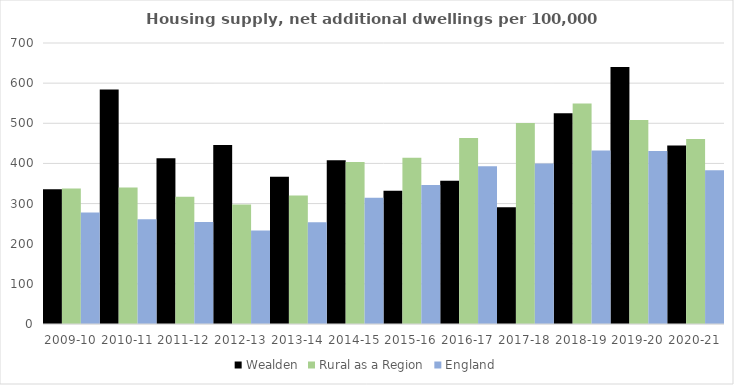
| Category | Wealden | Rural as a Region | England |
|---|---|---|---|
| 2009-10 | 335.375 | 337.852 | 277.548 |
| 2010-11 | 584.13 | 340.105 | 260.994 |
| 2011-12 | 412.944 | 317.04 | 254.007 |
| 2012-13 | 446.21 | 297.763 | 233.153 |
| 2013-14 | 366.547 | 319.835 | 253.602 |
| 2014-15 | 407.729 | 403.796 | 314.256 |
| 2015-16 | 331.654 | 414.091 | 346.154 |
| 2016-17 | 356.84 | 463.209 | 393.256 |
| 2017-18 | 290.674 | 500.68 | 399.646 |
| 2018-19 | 525.051 | 549.491 | 432.099 |
| 2019-20 | 640.347 | 508.493 | 431.187 |
| 2020-21 | 444.901 | 461.114 | 382.827 |